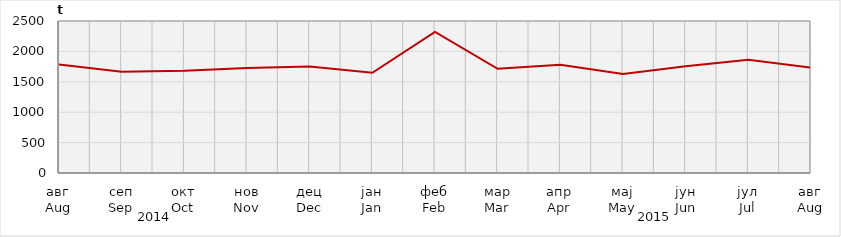
| Category | Нето тежина заклане стоке                              Net weight of  slaughtered livestock |
|---|---|
| авг
Aug | 1783969.1 |
| сеп
Sep | 1665798.6 |
| окт
Oct | 1681528.4 |
| нов
Nov | 1726709.59 |
| дец
Dec | 1751098 |
| јан
Jan | 1649074.16 |
| феб
Feb | 2321007.9 |
| мар
Mar | 1714725.6 |
| апр
Apr | 1780678.65 |
| мај
May | 1628212.69 |
| јун
Jun | 1753845.16 |
| јул
Jul | 1862492.5 |
| авг
Aug | 1733294.8 |